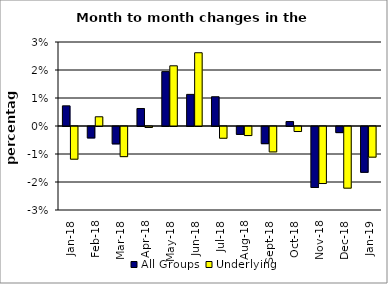
| Category | All Groups | Underlying |
|---|---|---|
| 2018-01-01 | 0.007 | -0.012 |
| 2018-02-01 | -0.004 | 0.003 |
| 2018-03-01 | -0.006 | -0.011 |
| 2018-04-01 | 0.006 | 0 |
| 2018-05-01 | 0.019 | 0.021 |
| 2018-06-01 | 0.011 | 0.026 |
| 2018-07-01 | 0.01 | -0.004 |
| 2018-08-01 | -0.003 | -0.003 |
| 2018-09-01 | -0.006 | -0.009 |
| 2018-10-01 | 0.002 | -0.002 |
| 2018-11-01 | -0.022 | -0.02 |
| 2018-12-01 | -0.002 | -0.022 |
| 2019-01-01 | -0.016 | -0.011 |